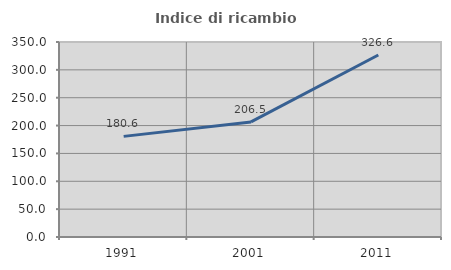
| Category | Indice di ricambio occupazionale  |
|---|---|
| 1991.0 | 180.608 |
| 2001.0 | 206.538 |
| 2011.0 | 326.601 |